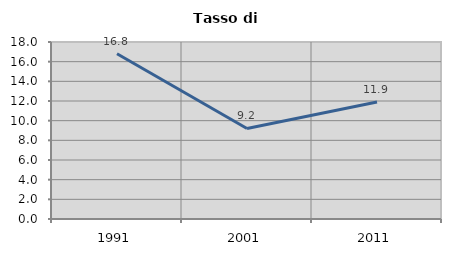
| Category | Tasso di disoccupazione   |
|---|---|
| 1991.0 | 16.807 |
| 2001.0 | 9.211 |
| 2011.0 | 11.893 |